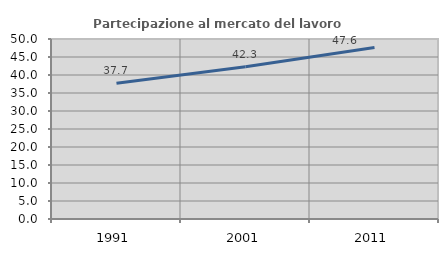
| Category | Partecipazione al mercato del lavoro  femminile |
|---|---|
| 1991.0 | 37.735 |
| 2001.0 | 42.285 |
| 2011.0 | 47.616 |